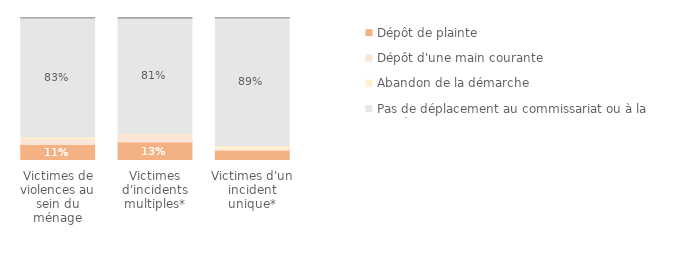
| Category | Dépôt de plainte | Dépôt d'une main courante | Abandon de la démarche | Pas de déplacement au commissariat ou à la gendarmerie | Ne sait pas/Refus |
|---|---|---|---|---|---|
| Victimes de violences au sein du ménage | 0.113 | 0.042 | 0.01 | 0.832 | 0.004 |
| Victimes d'incidents multiples* | 0.13 | 0.054 | 0.006 | 0.807 | 0.005 |
| Victimes d'un incident unique* | 0.071 | 0.013 | 0.02 | 0.894 | 0.003 |